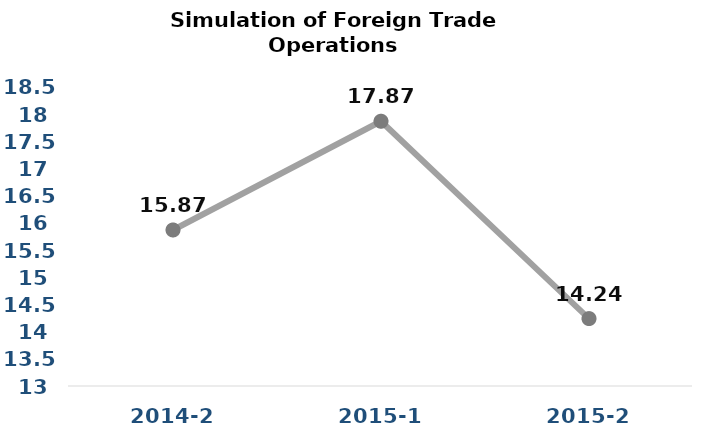
| Category | Series 0 |
|---|---|
| 2014-2 | 15.87 |
| 2015-1 | 17.87 |
| 2015-2 | 14.24 |